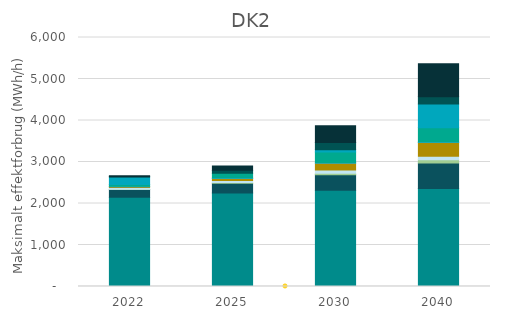
| Category | Klassisk elforbrug  | Individuelle varmepumper | Lastbiler og busser  | Banetranport | Personbiler og varebiler | Søtransport | Store varmepumper  | Elkedler | Store datacentre | Power-to-X |
|---|---|---|---|---|---|---|---|---|---|---|
| 2022.0 | 2151.394 | 184.016 | 7.741 | 39.948 | 19.467 | 13.422 | 43.288 | 177.592 | 9.062 | 20 |
| 2025.0 | 2253.808 | 232.696 | 17.367 | 48.306 | 47.434 | 13.381 | 118.075 | 0 | 72.937 | 100 |
| 2030.0 | 2321.664 | 369.018 | 38.307 | 76.338 | 165.443 | 13.003 | 257.877 | 55.521 | 175 | 400 |
| 2040.0 | 2359.235 | 617.399 | 80.549 | 78.799 | 333.903 | 13.929 | 340.526 | 571.045 | 174.522 | 800 |